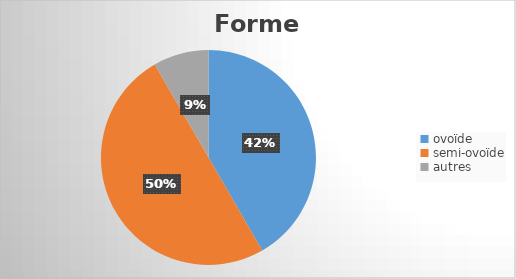
| Category | Series 0 |
|---|---|
| ovoïde | 10 |
| semi-ovoïde | 12 |
| autres | 2 |